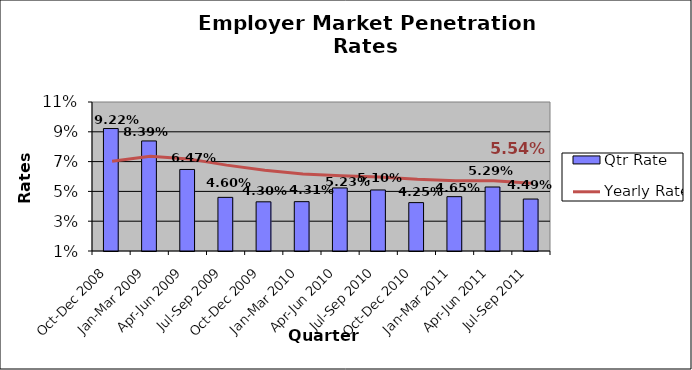
| Category | Qtr Rate |
|---|---|
| Oct-Dec 2008 | 0.092 |
| Jan-Mar 2009 | 0.084 |
| Apr-Jun 2009 | 0.065 |
| Jul-Sep 2009 | 0.046 |
| Oct-Dec 2009 | 0.043 |
| Jan-Mar 2010 | 0.043 |
| Apr-Jun 2010 | 0.052 |
| Jul-Sep 2010 | 0.051 |
| Oct-Dec 2010 | 0.042 |
| Jan-Mar 2011 | 0.046 |
| Apr-Jun 2011 | 0.053 |
| Jul-Sep 2011 | 0.045 |